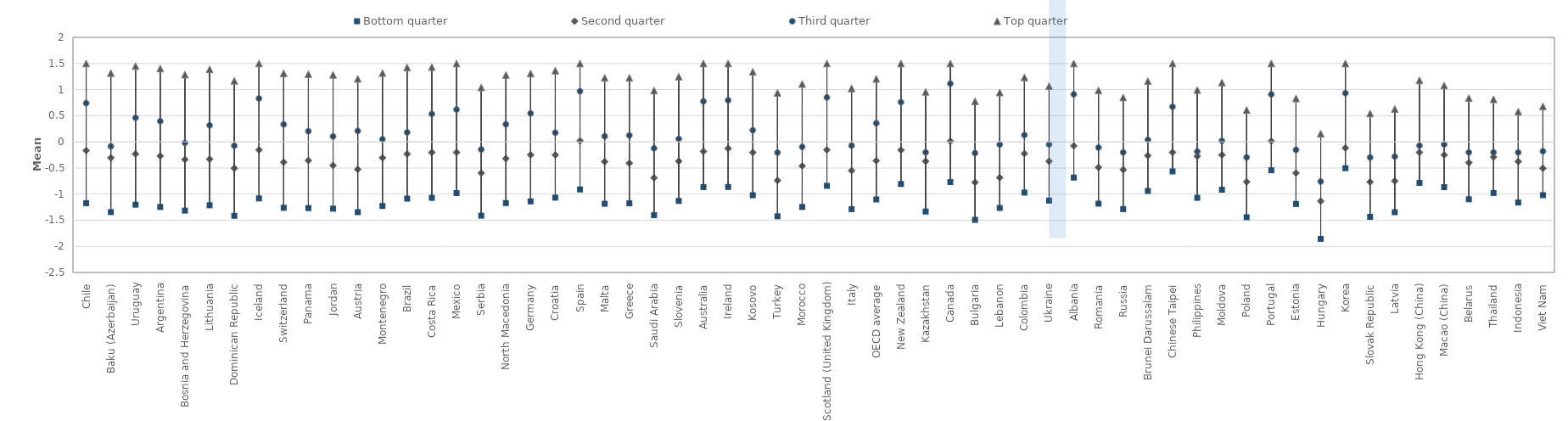
| Category | Bottom quarter | Second quarter | Third quarter | Top quarter |
|---|---|---|---|---|
| Chile | -1.174 | -0.165 | 0.739 | 1.499 |
| Baku (Azerbaijan) | -1.345 | -0.305 | -0.086 | 1.314 |
| Uruguay | -1.203 | -0.232 | 0.46 | 1.45 |
| Argentina | -1.247 | -0.27 | 0.395 | 1.404 |
| Bosnia and Herzegovina | -1.316 | -0.34 | -0.02 | 1.287 |
| Lithuania | -1.214 | -0.331 | 0.316 | 1.388 |
| Dominican Republic | -1.417 | -0.507 | -0.074 | 1.168 |
| Iceland | -1.083 | -0.154 | 0.83 | 1.499 |
| Switzerland | -1.263 | -0.39 | 0.335 | 1.311 |
| Panama | -1.268 | -0.357 | 0.203 | 1.296 |
| Jordan | -1.279 | -0.452 | 0.104 | 1.283 |
| Austria | -1.346 | -0.526 | 0.209 | 1.205 |
| Montenegro | -1.228 | -0.306 | 0.049 | 1.317 |
| Brazil | -1.087 | -0.233 | 0.181 | 1.425 |
| Costa Rica | -1.072 | -0.203 | 0.534 | 1.43 |
| Mexico | -0.981 | -0.201 | 0.618 | 1.499 |
| Serbia | -1.413 | -0.595 | -0.146 | 1.041 |
| North Macedonia | -1.172 | -0.319 | 0.336 | 1.279 |
| Germany | -1.139 | -0.249 | 0.545 | 1.307 |
| Croatia | -1.068 | -0.253 | 0.175 | 1.363 |
| Spain | -0.911 | 0.019 | 0.969 | 1.499 |
| Malta | -1.185 | -0.379 | 0.106 | 1.225 |
| Greece | -1.176 | -0.408 | 0.123 | 1.226 |
| Saudi Arabia | -1.404 | -0.687 | -0.124 | 0.981 |
| Slovenia | -1.131 | -0.372 | 0.058 | 1.247 |
| Australia | -0.866 | -0.183 | 0.775 | 1.499 |
| Ireland | -0.864 | -0.126 | 0.796 | 1.499 |
| Kosovo | -1.022 | -0.205 | 0.222 | 1.34 |
| Turkey | -1.425 | -0.74 | -0.205 | 0.937 |
| Morocco | -1.246 | -0.461 | -0.097 | 1.107 |
| Scotland (United Kingdom) | -0.842 | -0.155 | 0.849 | 1.499 |
| Italy | -1.289 | -0.55 | -0.072 | 1.023 |
| OECD average | -1.103 | -0.361 | 0.358 | 1.205 |
| New Zealand | -0.806 | -0.156 | 0.761 | 1.499 |
| Kazakhstan | -1.334 | -0.371 | -0.201 | 0.956 |
| Canada | -0.771 | 0.012 | 1.114 | 1.499 |
| Bulgaria | -1.493 | -0.776 | -0.216 | 0.776 |
| Lebanon | -1.266 | -0.684 | -0.051 | 0.944 |
| Colombia | -0.971 | -0.224 | 0.131 | 1.233 |
| Ukraine | -1.124 | -0.372 | -0.049 | 1.066 |
| Albania | -0.684 | -0.077 | 0.909 | 1.499 |
| Romania | -1.183 | -0.489 | -0.11 | 0.983 |
| Russia | -1.288 | -0.534 | -0.201 | 0.849 |
| Brunei Darussalam | -0.939 | -0.264 | 0.039 | 1.162 |
| Chinese Taipei | -0.567 | -0.201 | 0.672 | 1.499 |
| Philippines | -1.072 | -0.275 | -0.186 | 0.991 |
| Moldova | -0.916 | -0.251 | 0.019 | 1.135 |
| Poland | -1.443 | -0.766 | -0.297 | 0.608 |
| Portugal | -0.544 | 0.014 | 0.909 | 1.499 |
| Estonia | -1.189 | -0.598 | -0.153 | 0.831 |
| Hungary | -1.857 | -1.135 | -0.76 | 0.155 |
| Korea | -0.505 | -0.118 | 0.932 | 1.499 |
| Slovak Republic | -1.436 | -0.767 | -0.299 | 0.543 |
| Latvia | -1.347 | -0.751 | -0.281 | 0.628 |
| Hong Kong (China) | -0.786 | -0.201 | -0.072 | 1.177 |
| Macao (China) | -0.867 | -0.251 | -0.05 | 1.078 |
| Belarus | -1.099 | -0.399 | -0.201 | 0.837 |
| Thailand | -0.979 | -0.291 | -0.201 | 0.815 |
| Indonesia | -1.162 | -0.377 | -0.201 | 0.579 |
| Viet Nam | -1.021 | -0.505 | -0.18 | 0.679 |